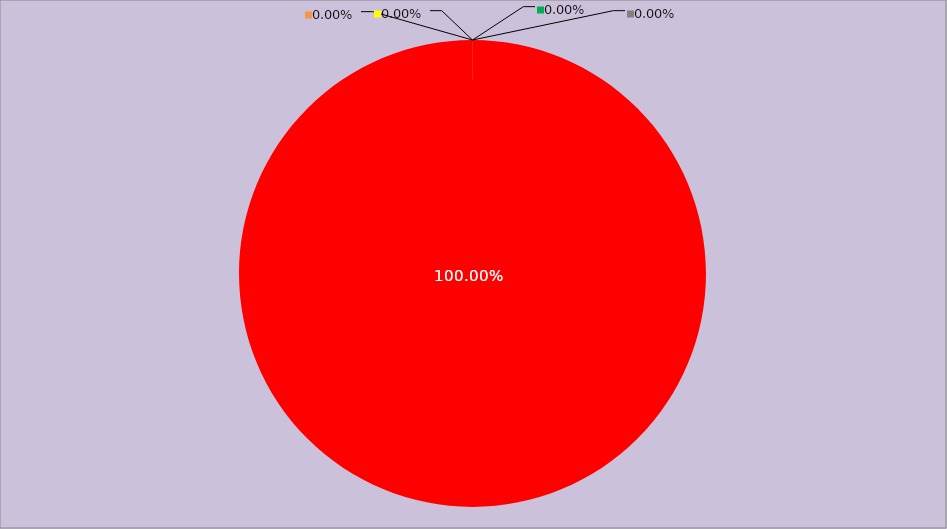
| Category | Année 2030 |
|---|---|
| Mesures non appliquées | 168 |
| Mesures appliquées mais peu ou pas documentées | 0 |
| Mesures appliquées et documentées | 0 |
| Mesures appliquées, documentées et contrôlées | 0 |
| Mesures non applicables | 0 |